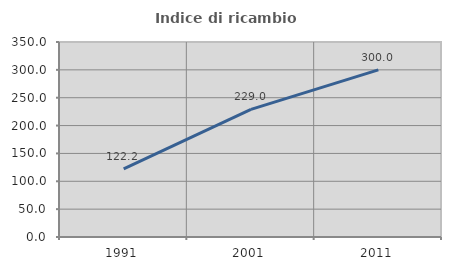
| Category | Indice di ricambio occupazionale  |
|---|---|
| 1991.0 | 122.222 |
| 2001.0 | 229.032 |
| 2011.0 | 300 |